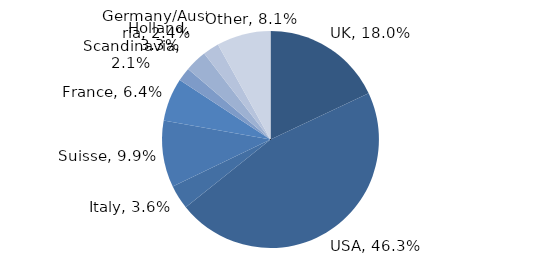
| Category | Investment Style |
|---|---|
| UK | 0.18 |
| USA | 0.463 |
| Italy | 0.036 |
| Suisse | 0.099 |
| France | 0.064 |
| Scandinavia | 0.021 |
| Holland | 0.033 |
| Germany/Austria | 0.024 |
| Other | 0.081 |